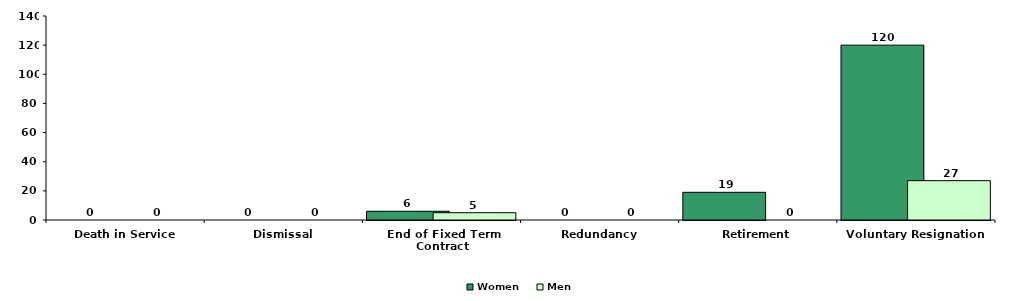
| Category | Women | Men |
|---|---|---|
| Death in Service | 0 | 0 |
| Dismissal | 0 | 0 |
| End of Fixed Term Contract | 6 | 5 |
| Redundancy | 0 | 0 |
| Retirement | 19 | 0 |
| Voluntary Resignation | 120 | 27 |